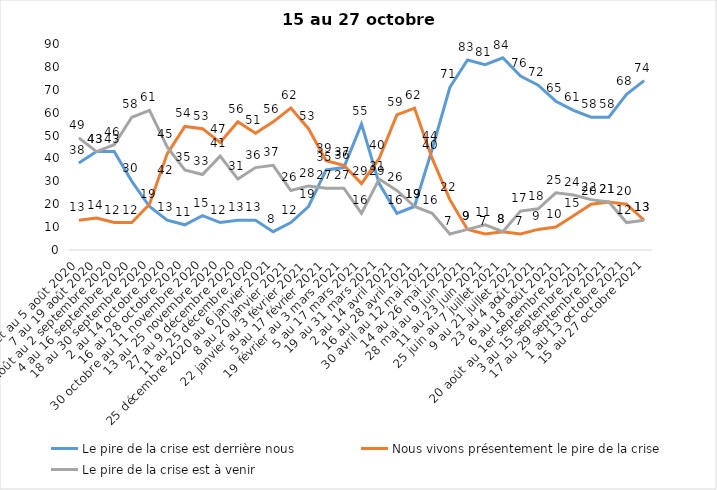
| Category | Le pire de la crise est derrière nous | Nous vivons présentement le pire de la crise | Le pire de la crise est à venir |
|---|---|---|---|
| 24 juillet au 5 août 2020 | 38 | 13 | 49 |
| 7 au 19 août 2020 | 43 | 14 | 43 |
| 21 août au 2 septembre 2020 | 43 | 12 | 46 |
| 4 au 16 septembre 2020 | 30 | 12 | 58 |
| 18 au 30 septembre 2020 | 19 | 20 | 61 |
| 2 au 14 octobre 2020 | 13 | 42 | 45 |
| 16 au 28 octobre 2020 | 11 | 54 | 35 |
| 30 octobre au 11 novembre 2020 | 15 | 53 | 33 |
| 13 au 25 novembre 2020 | 12 | 47 | 41 |
| 27 au 9 décembre 2020 | 13 | 56 | 31 |
| 11 au 25 décembre 2020 | 13 | 51 | 36 |
| 25 décembre 2020 au 6 janvier 2021 | 8 | 56 | 37 |
| 8 au 20 janvier 2021 | 12 | 62 | 26 |
| 22 janvier au 3 février 2021 | 19 | 53 | 28 |
| 5 au 17 février 2021 | 35 | 39 | 27 |
| 19 février au 3 mars 2021 | 36 | 37 | 27 |
| 5 au 17 mars 2021 | 55 | 29 | 16 |
| 19 au 31 mars 2021 | 29 | 40 | 31 |
| 2 au 14 avril 2021 | 16 | 59 | 26 |
| 16 au 28 avril 2021 | 19 | 62 | 19 |
| 30 avril au 12 mai 2021 | 44 | 40 | 16 |
| 14 au 26 mai 2021 | 71 | 22 | 7 |
| 28 mai au 9 juin 2021 | 83 | 9 | 9 |
| 11 au 23 juin 2021 | 81 | 7 | 11 |
| 25 juin au 7 juillet 2021 | 84 | 8 | 8 |
| 9 au 21 juillet 2021 | 76 | 7 | 17 |
| 23 au 4 août 2021 | 72 | 9 | 18 |
| 6 au 18 août 2021 | 65 | 10 | 25 |
| 20 août au 1er septembre 2021 | 61 | 15 | 24 |
| 3 au 15 septembre 2021 | 58 | 20 | 22 |
| 17 au 29 septembre 2021 | 58 | 21 | 21 |
| 1 au 13 octobre 2021 | 68 | 20 | 12 |
| 15 au 27 octobre 2021 | 74 | 13 | 13 |